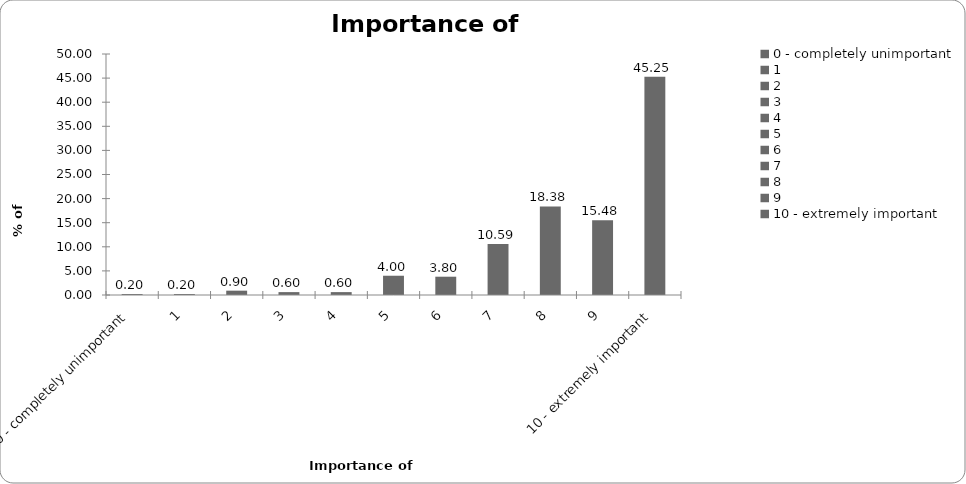
| Category | Importance of insurance |
|---|---|
| 0 - completely unimportant | 0.2 |
| 1 | 0.2 |
| 2 | 0.899 |
| 3 | 0.599 |
| 4 | 0.599 |
| 5 | 3.996 |
| 6 | 3.796 |
| 7 | 10.589 |
| 8 | 18.382 |
| 9 | 15.485 |
| 10 - extremely important | 45.255 |